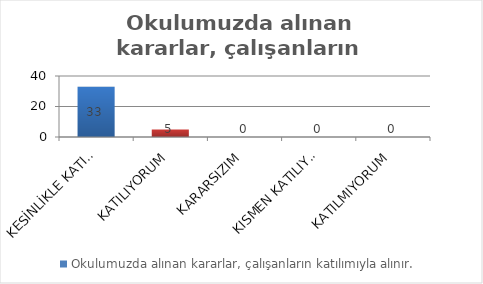
| Category | Okulumuzda alınan kararlar, çalışanların katılımıyla alınır. |
|---|---|
| KESİNLİKLE KATILIYORUM | 33 |
| KATILIYORUM | 5 |
| KARARSIZIM | 0 |
| KISMEN KATILIYORUM | 0 |
| KATILMIYORUM | 0 |